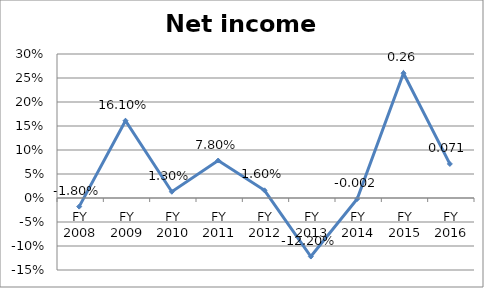
| Category | Net income ratio |
|---|---|
| FY 2016 | 0.071 |
| FY 2015 | 0.26 |
| FY 2014 | -0.002 |
| FY 2013 | -0.122 |
| FY 2012 | 0.016 |
| FY 2011 | 0.078 |
| FY 2010 | 0.013 |
| FY 2009 | 0.161 |
| FY 2008 | -0.018 |